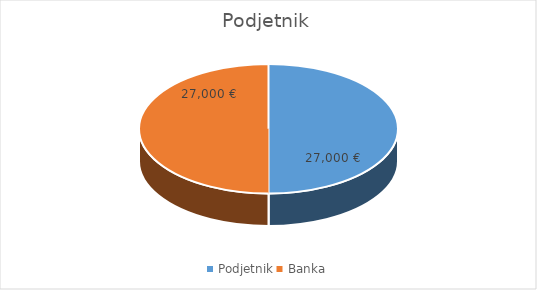
| Category | Series 0 |
|---|---|
| Podjetnik | 27000 |
| Banka | 27000 |